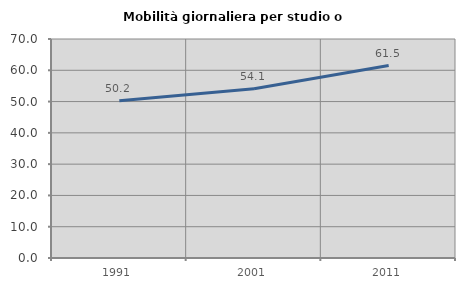
| Category | Mobilità giornaliera per studio o lavoro |
|---|---|
| 1991.0 | 50.246 |
| 2001.0 | 54.092 |
| 2011.0 | 61.522 |